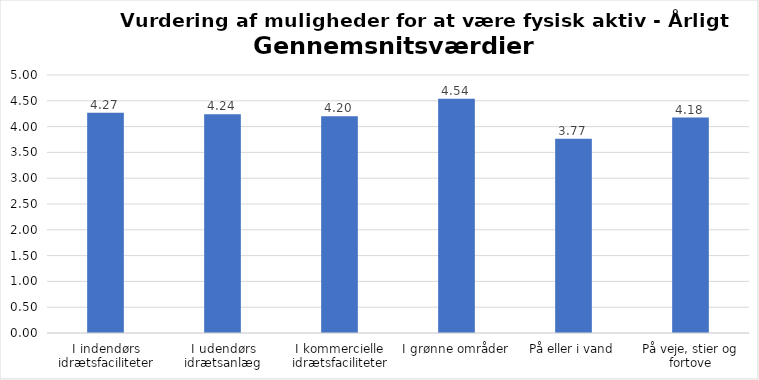
| Category | Gennemsnit |
|---|---|
| I indendørs idrætsfaciliteter | 4.269 |
| I udendørs idrætsanlæg | 4.239 |
| I kommercielle idrætsfaciliteter | 4.203 |
| I grønne områder | 4.54 |
| På eller i vand | 3.767 |
| På veje, stier og fortove | 4.176 |